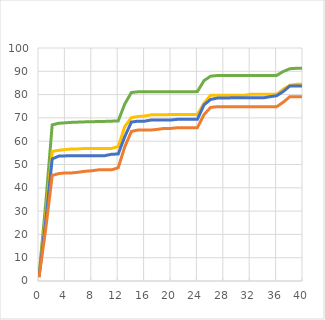
| Category | 1,00 1 Nicht-Migranten Mann | 2,00 2 Nicht-Migranten Frau | 3,00 3 Migranten Mann | 4,00 4 Migranten Frau |
|---|---|---|---|---|
| 0.0 | 2.3 | 1.6 | 2 | 1.6 |
| 1.0 | 32.6 | 27.5 | 25.2 | 21.9 |
| 2.0 | 67 | 55.6 | 52.4 | 45.3 |
| 3.0 | 67.7 | 56.1 | 53.6 | 46.1 |
| 4.0 | 67.9 | 56.4 | 53.7 | 46.4 |
| 5.0 | 68.1 | 56.7 | 53.8 | 46.4 |
| 6.0 | 68.2 | 56.7 | 53.8 | 46.7 |
| 7.0 | 68.3 | 56.9 | 53.8 | 47.1 |
| 8.0 | 68.3 | 56.9 | 53.8 | 47.3 |
| 9.0 | 68.5 | 56.9 | 53.8 | 47.7 |
| 10.0 | 68.5 | 56.9 | 53.8 | 47.7 |
| 11.0 | 68.6 | 56.9 | 54.4 | 47.7 |
| 12.0 | 68.7 | 57.7 | 54.5 | 48.6 |
| 13.0 | 76 | 66.3 | 62 | 57.6 |
| 14.0 | 80.9 | 70.1 | 68.2 | 64.2 |
| 15.0 | 81.2 | 70.6 | 68.6 | 64.8 |
| 16.0 | 81.2 | 70.8 | 68.6 | 64.8 |
| 17.0 | 81.2 | 71.3 | 69.1 | 64.8 |
| 18.0 | 81.2 | 71.3 | 69.1 | 65.1 |
| 19.0 | 81.2 | 71.3 | 69.1 | 65.5 |
| 20.0 | 81.2 | 71.5 | 69.1 | 65.5 |
| 21.0 | 81.2 | 71.5 | 69.4 | 65.8 |
| 22.0 | 81.2 | 71.5 | 69.4 | 65.8 |
| 23.0 | 81.2 | 71.5 | 69.4 | 65.8 |
| 24.0 | 81.3 | 71.5 | 69.4 | 65.8 |
| 25.0 | 86 | 76.3 | 75.6 | 71.4 |
| 26.0 | 87.9 | 79.7 | 77.9 | 74.5 |
| 27.0 | 88.2 | 79.7 | 78.5 | 74.8 |
| 28.0 | 88.2 | 79.7 | 78.5 | 74.8 |
| 29.0 | 88.2 | 79.7 | 78.6 | 74.8 |
| 30.0 | 88.2 | 79.7 | 78.6 | 74.8 |
| 31.0 | 88.2 | 79.7 | 78.6 | 74.8 |
| 32.0 | 88.2 | 80.1 | 78.6 | 74.8 |
| 33.0 | 88.2 | 80.1 | 78.6 | 74.8 |
| 34.0 | 88.2 | 80.1 | 78.6 | 74.8 |
| 35.0 | 88.2 | 80.1 | 79.1 | 74.8 |
| 36.0 | 88.2 | 80.1 | 79.5 | 74.8 |
| 37.0 | 89.9 | 82.3 | 81.3 | 76.7 |
| 38.0 | 91.1 | 84 | 83.7 | 79.1 |
| 39.0 | 91.3 | 84.4 | 83.7 | 79.1 |
| 40.0 | 91.3 | 84.4 | 83.7 | 79.1 |